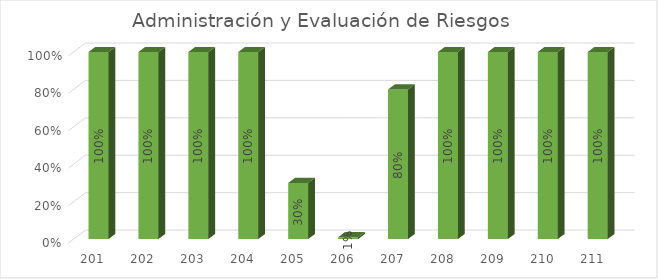
| Category | % Avance |
|---|---|
| 201.0 | 1 |
| 202.0 | 1 |
| 203.0 | 1 |
| 204.0 | 1 |
| 205.0 | 0.3 |
| 206.0 | 0.01 |
| 207.0 | 0.8 |
| 208.0 | 1 |
| 209.0 | 1 |
| 210.0 | 1 |
| 211.0 | 1 |